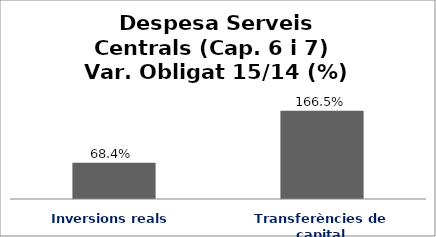
| Category | Series 0 |
|---|---|
| Inversions reals | 0.684 |
| Transferències de capital | 1.665 |